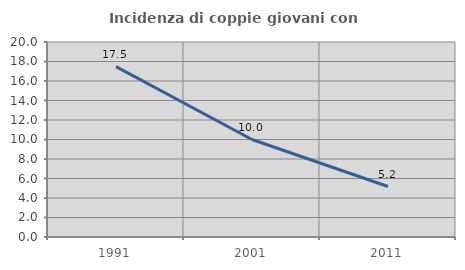
| Category | Incidenza di coppie giovani con figli |
|---|---|
| 1991.0 | 17.468 |
| 2001.0 | 10 |
| 2011.0 | 5.179 |